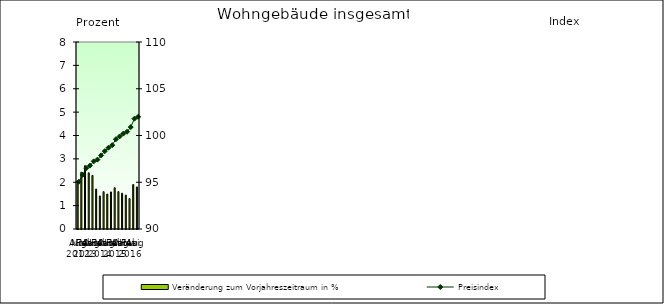
| Category | Veränderung zum Vorjahreszeitraum in % |
|---|---|
| 0 | 1.949 |
| 1 | 2.43 |
| 2 | 2.708 |
| 3 | 2.404 |
| 4 | 2.294 |
| 5 | 1.708 |
| 6 | 1.412 |
| 7 | 1.596 |
| 8 | 1.495 |
| 9 | 1.586 |
| 10 | 1.764 |
| 11 | 1.599 |
| 12 | 1.529 |
| 13 | 1.451 |
| 14 | 1.305 |
| 15 | 1.902 |
| 16 | 1.8 |